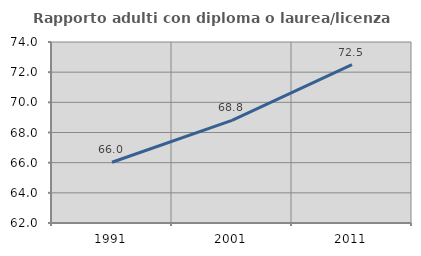
| Category | Rapporto adulti con diploma o laurea/licenza media  |
|---|---|
| 1991.0 | 66.026 |
| 2001.0 | 68.803 |
| 2011.0 | 72.5 |